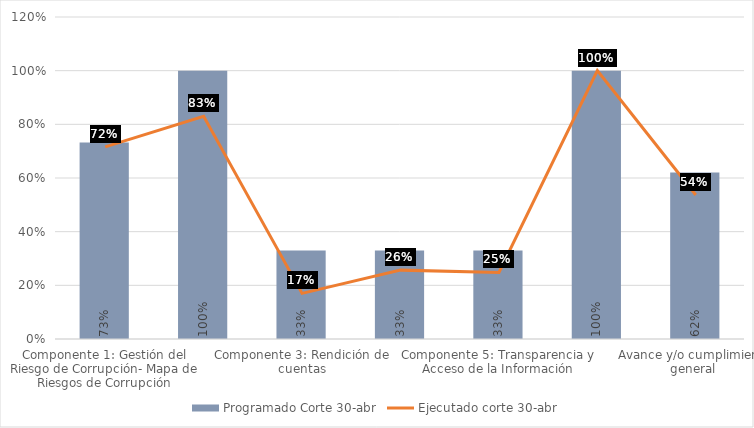
| Category | Programado Corte 30-abr | Componente 1: Gestión del Riesgo de Corrupción- Mapa de Riesgos de Corrupción | Ejecutado corte 31-ago |
|---|---|---|---|
| Componente 1: Gestión del Riesgo de Corrupción- Mapa de Riesgos de Corrupción | 0.732 |  |  |
| Componente 2: Estratégia de Racionalización de Trámites | 1 |  |  |
| Componente 3: Rendición de cuentas | 0.33 |  |  |
| Componente 4: Atención al ciudadano | 0.33 |  |  |
| Componente 5: Transparencia y Acceso de la Información | 0.33 |  |  |
| Componente 6: Plan Gestión de la Integridad | 1 |  |  |
| Avance y/o cumplimiento general  | 0.62 |  |  |